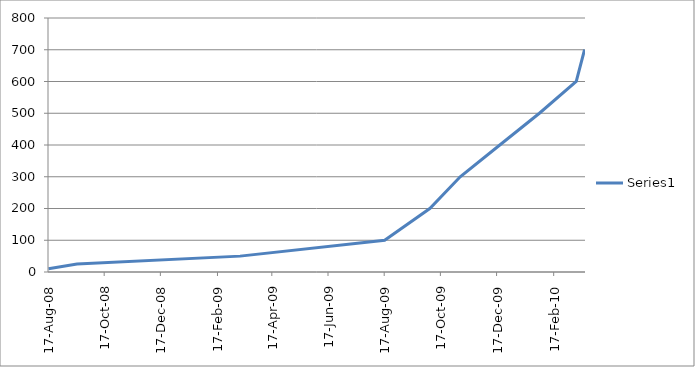
| Category | Series 0 |
|---|---|
| 2008-08-17 | 10 |
| 2008-09-17 | 25 |
| 2009-03-13 | 50 |
| 2009-08-17 | 100 |
| 2009-10-05 | 200 |
| 2009-11-07 | 300 |
| 2009-12-20 | 400 |
| 2010-02-01 | 500 |
| 2010-03-13 | 600 |
| 2010-03-22 | 700 |